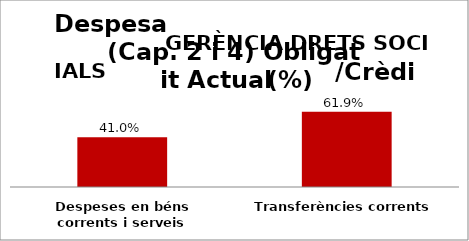
| Category | Series 0 |
|---|---|
| Despeses en béns corrents i serveis | 0.41 |
| Transferències corrents | 0.619 |